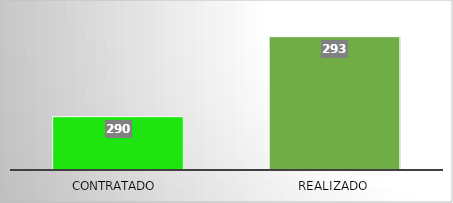
| Category | Series 0 |
|---|---|
| Contratado  | 290 |
| Realizado | 293 |